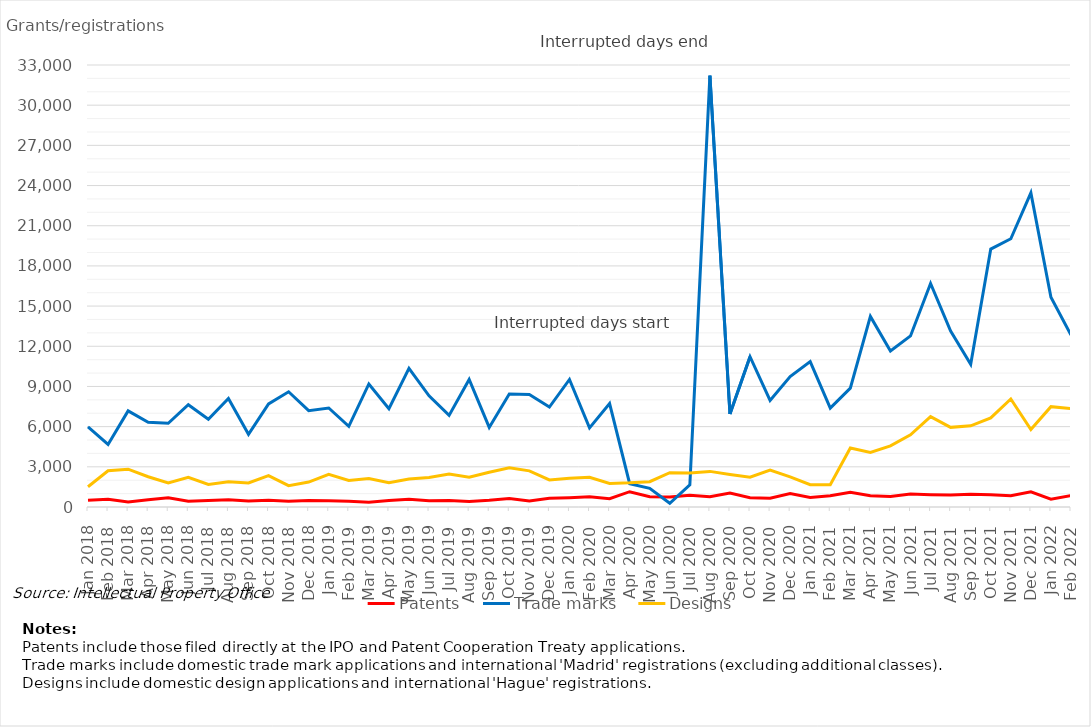
| Category | Patents | Trade marks | Designs |
|---|---|---|---|
| Jan 2018 | 495 | 5979 | 1512 |
| Feb 2018 | 574 | 4670 | 2704 |
| Mar 2018 | 370 | 7178 | 2825 |
| Apr 2018 | 543 | 6332 | 2259 |
| May 2018 | 690 | 6252 | 1789 |
| Jun 2018 | 424 | 7636 | 2222 |
| Jul 2018 | 486 | 6547 | 1678 |
| Aug 2018 | 536 | 8103 | 1878 |
| Sep 2018 | 450 | 5429 | 1795 |
| Oct 2018 | 498 | 7701 | 2348 |
| Nov 2018 | 432 | 8603 | 1592 |
| Dec 2018 | 484 | 7190 | 1859 |
| Jan 2019 | 475 | 7392 | 2444 |
| Feb 2019 | 426 | 6023 | 1987 |
| Mar 2019 | 363 | 9185 | 2125 |
| Apr 2019 | 488 | 7335 | 1810 |
| May 2019 | 573 | 10344 | 2096 |
| Jun 2019 | 471 | 8304 | 2202 |
| Jul 2019 | 489 | 6839 | 2464 |
| Aug 2019 | 420 | 9518 | 2218 |
| Sep 2019 | 500 | 5943 | 2596 |
| Oct 2019 | 634 | 8435 | 2926 |
| Nov 2019 | 455 | 8398 | 2700 |
| Dec 2019 | 654 | 7465 | 2021 |
| Jan 2020 | 696 | 9523 | 2145 |
| Feb 2020 | 756 | 5905 | 2220 |
| Mar 2020 | 622 | 7722 | 1757 |
| Apr 2020 | 1143 | 1742 | 1803 |
| May 2020 | 768 | 1397 | 1888 |
| Jun 2020 | 740 | 280 | 2564 |
| Jul 2020 | 878 | 1658 | 2539 |
| Aug 2020 | 771 | 32204 | 2659 |
| Sep 2020 | 1042 | 6946 | 2425 |
| Oct 2020 | 697 | 11218 | 2223 |
| Nov 2020 | 649 | 7954 | 2763 |
| Dec 2020 | 1010 | 9745 | 2252 |
| Jan 2021 | 708 | 10856 | 1665 |
| Feb 2021 | 838 | 7380 | 1660 |
| Mar 2021 | 1107 | 8877 | 4408 |
| Apr 2021 | 838 | 14232 | 4075 |
| May 2021 | 788 | 11653 | 4562 |
| Jun 2021 | 972 | 12772 | 5393 |
| Jul 2021 | 918 | 16692 | 6744 |
| Aug 2021 | 887 | 13143 | 5946 |
| Sep 2021 | 947 | 10649 | 6063 |
| Oct 2021 | 920 | 19254 | 6657 |
| Nov 2021 | 841 | 20028 | 8063 |
| Dec 2021 | 1131 | 23451 | 5785 |
| Jan 2022 | 585 | 15662 | 7493 |
| Feb 2022 | 860 | 12838 | 7344 |